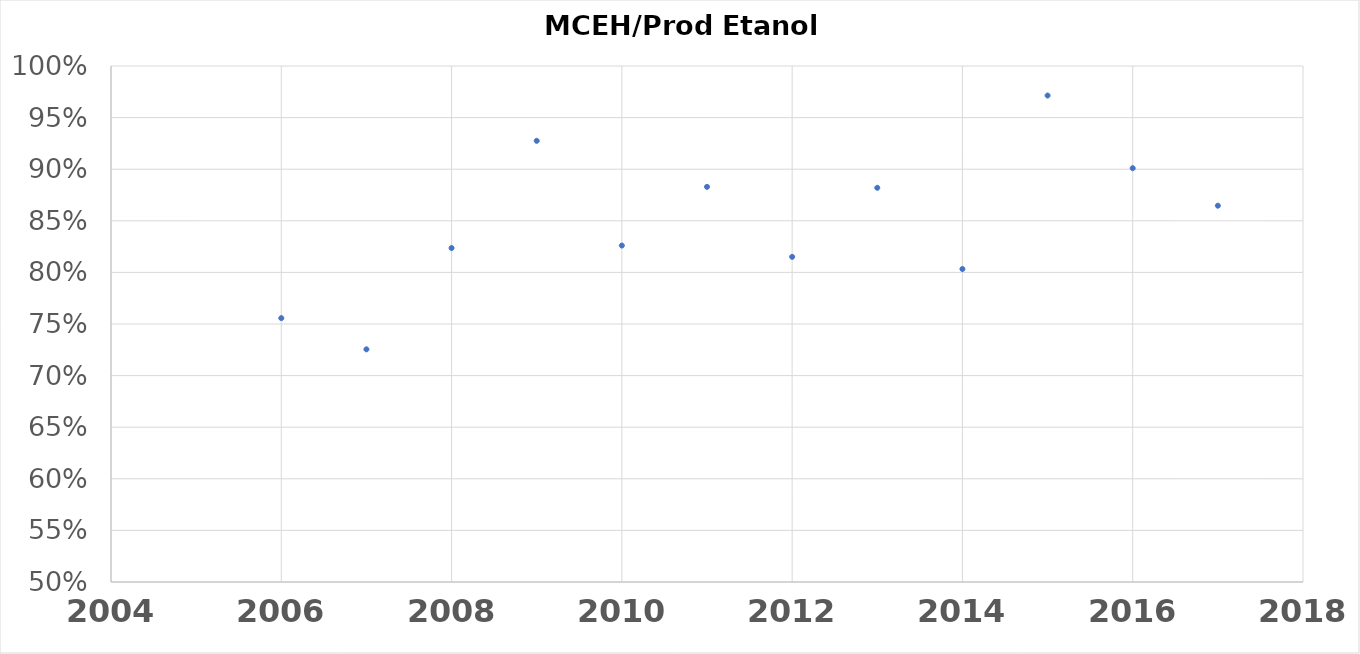
| Category | Series 0 |
|---|---|
| 2006.0 | 0.756 |
| 2007.0 | 0.725 |
| 2008.0 | 0.824 |
| 2009.0 | 0.927 |
| 2010.0 | 0.826 |
| 2011.0 | 0.883 |
| 2012.0 | 0.815 |
| 2013.0 | 0.882 |
| 2014.0 | 0.803 |
| 2015.0 | 0.971 |
| 2016.0 | 0.901 |
| 2017.0 | 0.865 |